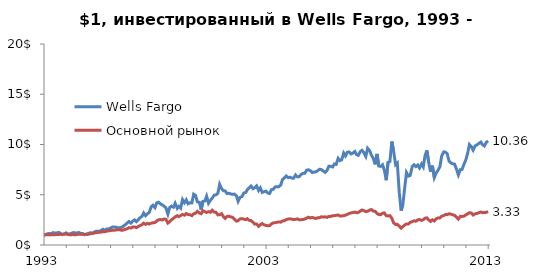
| Category | Wells Fargo | Основной рынок |
|---|---|---|
| 1993-01-04 | 1 | 1 |
| 1993-02-01 | 1.039 | 1.01 |
| 1993-03-01 | 1.113 | 1.029 |
| 1993-04-01 | 1.149 | 1.003 |
| 1993-05-03 | 1.116 | 1.026 |
| 1993-06-01 | 1.23 | 1.027 |
| 1993-07-01 | 1.182 | 1.021 |
| 1993-08-02 | 1.2 | 1.056 |
| 1993-09-01 | 1.251 | 1.046 |
| 1993-10-01 | 1.164 | 1.066 |
| 1993-11-01 | 1.042 | 1.052 |
| 1993-12-01 | 1.11 | 1.063 |
| 1994-01-03 | 1.209 | 1.098 |
| 1994-02-01 | 1.078 | 1.065 |
| 1994-03-01 | 1.096 | 1.016 |
| 1994-04-04 | 1.182 | 1.028 |
| 1994-05-02 | 1.236 | 1.04 |
| 1994-06-01 | 1.206 | 1.013 |
| 1994-07-01 | 1.206 | 1.044 |
| 1994-08-01 | 1.239 | 1.084 |
| 1994-09-01 | 1.152 | 1.055 |
| 1994-10-03 | 1.149 | 1.077 |
| 1994-11-01 | 1.021 | 1.034 |
| 1994-12-01 | 1.099 | 1.047 |
| 1995-01-03 | 1.137 | 1.072 |
| 1995-02-01 | 1.218 | 1.111 |
| 1995-03-01 | 1.2 | 1.141 |
| 1995-04-03 | 1.254 | 1.173 |
| 1995-05-01 | 1.355 | 1.216 |
| 1995-06-01 | 1.373 | 1.242 |
| 1995-07-03 | 1.349 | 1.281 |
| 1995-08-01 | 1.451 | 1.281 |
| 1995-09-01 | 1.564 | 1.332 |
| 1995-10-02 | 1.421 | 1.325 |
| 1995-11-01 | 1.603 | 1.38 |
| 1995-12-01 | 1.603 | 1.404 |
| 1996-01-02 | 1.681 | 1.45 |
| 1996-02-01 | 1.785 | 1.46 |
| 1996-03-01 | 1.797 | 1.471 |
| 1996-04-01 | 1.767 | 1.491 |
| 1996-05-01 | 1.719 | 1.525 |
| 1996-06-03 | 1.719 | 1.528 |
| 1996-07-01 | 1.749 | 1.458 |
| 1996-08-01 | 1.869 | 1.486 |
| 1996-09-03 | 2.024 | 1.566 |
| 1996-10-01 | 2.179 | 1.607 |
| 1996-11-01 | 2.334 | 1.725 |
| 1996-12-02 | 2.173 | 1.688 |
| 1997-01-02 | 2.379 | 1.792 |
| 1997-02-03 | 2.499 | 1.802 |
| 1997-03-03 | 2.325 | 1.726 |
| 1997-04-01 | 2.507 | 1.826 |
| 1997-05-01 | 2.704 | 1.933 |
| 1997-06-02 | 2.842 | 2.017 |
| 1997-07-01 | 3.188 | 2.175 |
| 1997-08-01 | 2.916 | 2.05 |
| 1997-09-02 | 3.11 | 2.159 |
| 1997-10-01 | 3.257 | 2.084 |
| 1997-11-03 | 3.821 | 2.177 |
| 1997-12-01 | 3.955 | 2.212 |
| 1998-01-02 | 3.719 | 2.234 |
| 1998-02-02 | 4.203 | 2.391 |
| 1998-03-02 | 4.26 | 2.511 |
| 1998-04-01 | 4.09 | 2.534 |
| 1998-05-01 | 4.003 | 2.486 |
| 1998-06-01 | 3.86 | 2.584 |
| 1998-07-01 | 3.701 | 2.554 |
| 1998-08-03 | 3.081 | 2.182 |
| 1998-09-01 | 3.725 | 2.318 |
| 1998-10-01 | 3.869 | 2.504 |
| 1998-11-02 | 3.758 | 2.652 |
| 1998-12-01 | 4.155 | 2.801 |
| 1999-01-04 | 3.642 | 2.916 |
| 1999-02-01 | 3.845 | 2.822 |
| 1999-03-01 | 3.669 | 2.932 |
| 1999-04-01 | 4.519 | 3.043 |
| 1999-05-03 | 4.203 | 2.967 |
| 1999-06-01 | 4.493 | 3.128 |
| 1999-07-01 | 4.099 | 3.028 |
| 1999-08-02 | 4.206 | 3.009 |
| 1999-09-01 | 4.185 | 2.923 |
| 1999-10-01 | 5.057 | 3.106 |
| 1999-11-01 | 4.931 | 3.165 |
| 1999-12-01 | 4.29 | 3.348 |
| 2000-01-03 | 4.242 | 3.178 |
| 2000-02-01 | 3.525 | 3.114 |
| 2000-03-01 | 4.346 | 3.415 |
| 2000-04-03 | 4.379 | 3.31 |
| 2000-05-01 | 4.851 | 3.238 |
| 2000-06-01 | 4.155 | 3.315 |
| 2000-07-03 | 4.451 | 3.261 |
| 2000-08-01 | 4.657 | 3.459 |
| 2000-09-01 | 4.952 | 3.274 |
| 2000-10-02 | 4.991 | 3.258 |
| 2000-11-01 | 5.14 | 2.997 |
| 2000-12-01 | 6.036 | 3.009 |
| 2001-01-02 | 5.609 | 3.113 |
| 2001-02-01 | 5.403 | 2.826 |
| 2001-03-01 | 5.385 | 2.644 |
| 2001-04-02 | 5.113 | 2.848 |
| 2001-05-01 | 5.152 | 2.862 |
| 2001-06-01 | 5.081 | 2.79 |
| 2001-07-02 | 5.039 | 2.76 |
| 2001-08-01 | 5.063 | 2.583 |
| 2001-09-04 | 4.893 | 2.372 |
| 2001-10-01 | 4.346 | 2.415 |
| 2001-11-01 | 4.74 | 2.597 |
| 2001-12-03 | 4.812 | 2.617 |
| 2002-01-02 | 5.167 | 2.576 |
| 2002-02-04 | 5.224 | 2.522 |
| 2002-03-01 | 5.501 | 2.615 |
| 2002-04-01 | 5.696 | 2.454 |
| 2002-05-01 | 5.866 | 2.432 |
| 2002-06-03 | 5.606 | 2.256 |
| 2002-07-01 | 5.696 | 2.078 |
| 2002-08-01 | 5.878 | 2.088 |
| 2002-09-03 | 5.424 | 1.858 |
| 2002-10-01 | 5.684 | 2.019 |
| 2002-11-01 | 5.233 | 2.134 |
| 2002-12-02 | 5.307 | 2.005 |
| 2003-01-02 | 5.364 | 1.95 |
| 2003-02-03 | 5.167 | 1.917 |
| 2003-03-03 | 5.128 | 1.933 |
| 2003-04-01 | 5.501 | 2.09 |
| 2003-05-01 | 5.54 | 2.196 |
| 2003-06-02 | 5.779 | 2.221 |
| 2003-07-01 | 5.794 | 2.257 |
| 2003-08-01 | 5.803 | 2.297 |
| 2003-09-02 | 5.961 | 2.27 |
| 2003-10-01 | 6.516 | 2.395 |
| 2003-11-03 | 6.69 | 2.412 |
| 2003-12-01 | 6.872 | 2.534 |
| 2004-01-02 | 6.699 | 2.578 |
| 2004-02-02 | 6.743 | 2.609 |
| 2004-03-01 | 6.663 | 2.567 |
| 2004-04-01 | 6.639 | 2.524 |
| 2004-05-03 | 6.97 | 2.554 |
| 2004-06-01 | 6.782 | 2.6 |
| 2004-07-01 | 6.803 | 2.511 |
| 2004-08-02 | 7.021 | 2.517 |
| 2004-09-01 | 7.125 | 2.54 |
| 2004-10-01 | 7.137 | 2.576 |
| 2004-11-01 | 7.442 | 2.675 |
| 2004-12-01 | 7.487 | 2.762 |
| 2005-01-03 | 7.385 | 2.692 |
| 2005-02-01 | 7.209 | 2.743 |
| 2005-03-01 | 7.26 | 2.691 |
| 2005-04-01 | 7.278 | 2.637 |
| 2005-05-02 | 7.394 | 2.715 |
| 2005-06-01 | 7.537 | 2.715 |
| 2005-07-01 | 7.507 | 2.813 |
| 2005-08-01 | 7.358 | 2.781 |
| 2005-09-01 | 7.23 | 2.801 |
| 2005-10-03 | 7.43 | 2.751 |
| 2005-11-01 | 7.827 | 2.848 |
| 2005-12-01 | 7.824 | 2.845 |
| 2006-01-03 | 7.764 | 2.917 |
| 2006-02-01 | 8.063 | 2.919 |
| 2006-03-01 | 8.021 | 2.951 |
| 2006-04-03 | 8.624 | 2.987 |
| 2006-05-01 | 8.397 | 2.895 |
| 2006-06-01 | 8.487 | 2.895 |
| 2006-07-03 | 9.152 | 2.91 |
| 2006-08-01 | 8.863 | 2.971 |
| 2006-09-01 | 9.227 | 3.044 |
| 2006-10-02 | 9.257 | 3.14 |
| 2006-11-01 | 9.057 | 3.192 |
| 2006-12-01 | 9.14 | 3.232 |
| 2007-01-03 | 9.304 | 3.278 |
| 2007-02-01 | 8.988 | 3.206 |
| 2007-03-01 | 8.919 | 3.238 |
| 2007-04-02 | 9.299 | 3.378 |
| 2007-05-01 | 9.421 | 3.488 |
| 2007-06-01 | 9.182 | 3.426 |
| 2007-07-02 | 8.815 | 3.317 |
| 2007-08-01 | 9.624 | 3.359 |
| 2007-09-04 | 9.382 | 3.48 |
| 2007-10-01 | 8.958 | 3.531 |
| 2007-11-01 | 8.624 | 3.376 |
| 2007-12-03 | 8.027 | 3.346 |
| 2008-01-02 | 9.063 | 3.142 |
| 2008-02-01 | 7.854 | 3.033 |
| 2008-03-03 | 7.818 | 3.014 |
| 2008-04-01 | 7.991 | 3.158 |
| 2008-05-01 | 7.481 | 3.192 |
| 2008-06-02 | 6.445 | 2.917 |
| 2008-07-01 | 8.212 | 2.888 |
| 2008-08-01 | 8.301 | 2.924 |
| 2008-09-02 | 10.296 | 2.658 |
| 2008-10-01 | 9.34 | 2.208 |
| 2008-11-03 | 8.003 | 2.043 |
| 2008-12-01 | 8.164 | 2.059 |
| 2009-01-02 | 5.236 | 1.882 |
| 2009-02-02 | 3.415 | 1.675 |
| 2009-03-02 | 4.018 | 1.818 |
| 2009-04-01 | 5.645 | 1.989 |
| 2009-05-01 | 7.209 | 2.095 |
| 2009-06-01 | 6.86 | 2.095 |
| 2009-07-01 | 6.916 | 2.251 |
| 2009-08-03 | 7.797 | 2.326 |
| 2009-09-01 | 7.982 | 2.409 |
| 2009-10-01 | 7.797 | 2.362 |
| 2009-11-02 | 7.958 | 2.497 |
| 2009-12-01 | 7.66 | 2.541 |
| 2010-01-04 | 8.069 | 2.447 |
| 2010-02-01 | 7.773 | 2.517 |
| 2010-03-01 | 8.848 | 2.665 |
| 2010-04-01 | 9.412 | 2.705 |
| 2010-05-03 | 8.17 | 2.483 |
| 2010-06-01 | 7.29 | 2.349 |
| 2010-07-01 | 7.896 | 2.511 |
| 2010-08-02 | 6.716 | 2.391 |
| 2010-09-01 | 7.164 | 2.601 |
| 2010-10-01 | 7.433 | 2.697 |
| 2010-11-01 | 7.776 | 2.691 |
| 2010-12-01 | 8.857 | 2.866 |
| 2011-01-03 | 9.266 | 2.931 |
| 2011-02-01 | 9.233 | 3.025 |
| 2011-03-01 | 9.096 | 3.022 |
| 2011-04-01 | 8.349 | 3.108 |
| 2011-05-02 | 8.17 | 3.066 |
| 2011-06-01 | 8.081 | 3.01 |
| 2011-07-01 | 8.048 | 2.945 |
| 2011-08-01 | 7.552 | 2.778 |
| 2011-09-01 | 6.979 | 2.579 |
| 2011-10-03 | 7.496 | 2.856 |
| 2011-11-01 | 7.516 | 2.842 |
| 2011-12-01 | 8.012 | 2.866 |
| 2012-01-03 | 8.493 | 2.991 |
| 2012-02-01 | 9.134 | 3.112 |
| 2012-03-01 | 9.994 | 3.21 |
| 2012-04-02 | 9.785 | 3.186 |
| 2012-05-01 | 9.445 | 2.986 |
| 2012-06-01 | 9.854 | 3.104 |
| 2012-07-02 | 9.964 | 3.144 |
| 2012-08-01 | 10.093 | 3.206 |
| 2012-09-04 | 10.242 | 3.283 |
| 2012-10-01 | 9.991 | 3.218 |
| 2012-11-01 | 9.854 | 3.228 |
| 2012-12-03 | 10.203 | 3.25 |
| 2013-01-02 | 10.361 | 3.33 |